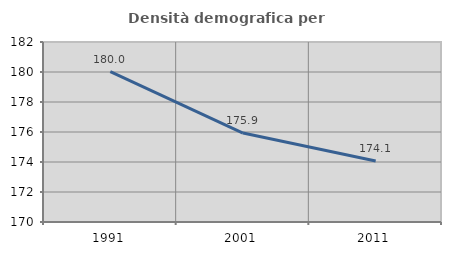
| Category | Densità demografica |
|---|---|
| 1991.0 | 180.019 |
| 2001.0 | 175.928 |
| 2011.0 | 174.068 |